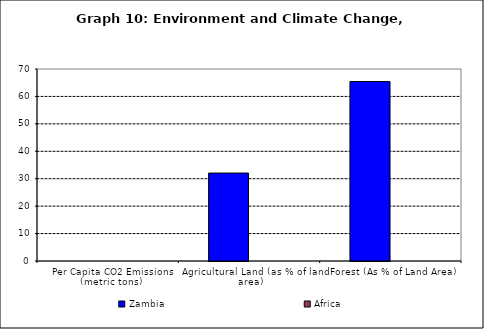
| Category | Zambia | Africa |
|---|---|---|
| Per Capita CO2 Emissions (metric tons) | 0 | 0 |
| Agricultural Land (as % of land area) | 32.064 | 0 |
| Forest (As % of Land Area) | 65.423 | 0 |